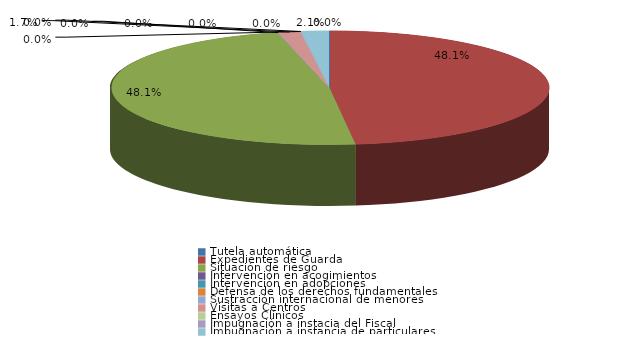
| Category | Series 0 |
|---|---|
| Tutela automática | 0 |
| Expedientes de Guarda | 115 |
| Situación de riesgo | 115 |
| Intervención en acogimientos | 0 |
| Intervención en adopciones | 0 |
| Defensa de los derechos fundamentales | 0 |
| Sustracción internacional de menores | 0 |
| Visitas a Centros | 4 |
| Ensayos Clínicos | 0 |
| Impugnación a instacia del Fiscal | 0 |
| Impugnación a instancia de particulares | 5 |